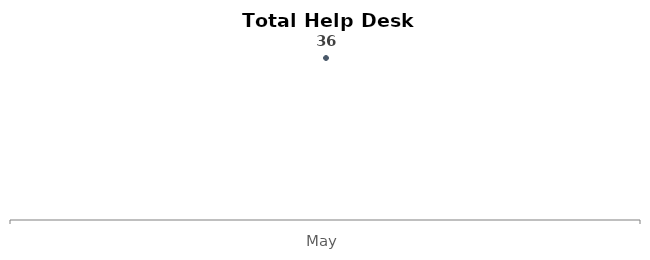
| Category | Total |
|---|---|
| May | 36 |